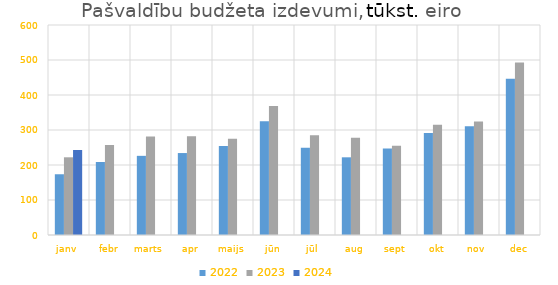
| Category | 2022 | 2023 | 2024 |
|---|---|---|---|
| janv | 173548.423 | 221986.169 | 243159.273 |
| febr | 208650.357 | 257310.25 | 0 |
| marts | 226166.321 | 281685.717 | 0 |
| apr | 234145.666 | 282101.213 | 0 |
| maijs | 253995.943 | 274959.68 | 0 |
| jūn | 325201.018 | 368738.502 | 0 |
| jūl | 249623.438 | 285193.851 | 0 |
| aug | 221979.814 | 277676.465 | 0 |
| sept | 247335.901 | 255025.415 | 0 |
| okt | 291387.208 | 315119.239 | 0 |
| nov | 310697.322 | 324385.045 | 0 |
| dec | 446706.592 | 492764.721 | 0 |